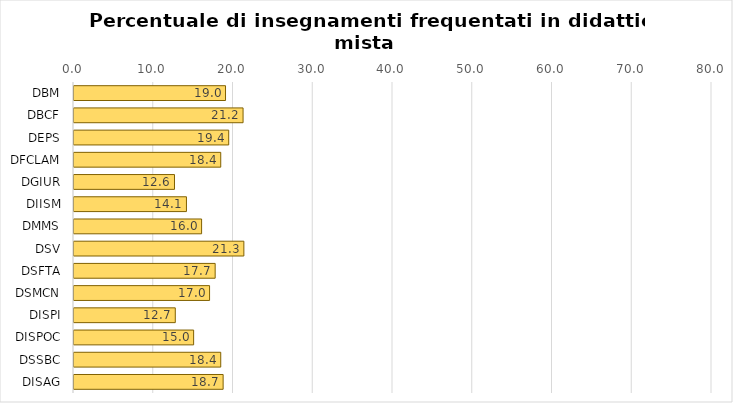
| Category | Series 0 |
|---|---|
| DBM | 19 |
| DBCF | 21.2 |
| DEPS | 19.4 |
| DFCLAM | 18.4 |
| DGIUR | 12.6 |
| DIISM | 14.1 |
| DMMS | 16 |
| DSV | 21.3 |
| DSFTA | 17.7 |
| DSMCN | 17 |
| DISPI | 12.7 |
| DISPOC | 15 |
| DSSBC | 18.4 |
| DISAG | 18.7 |